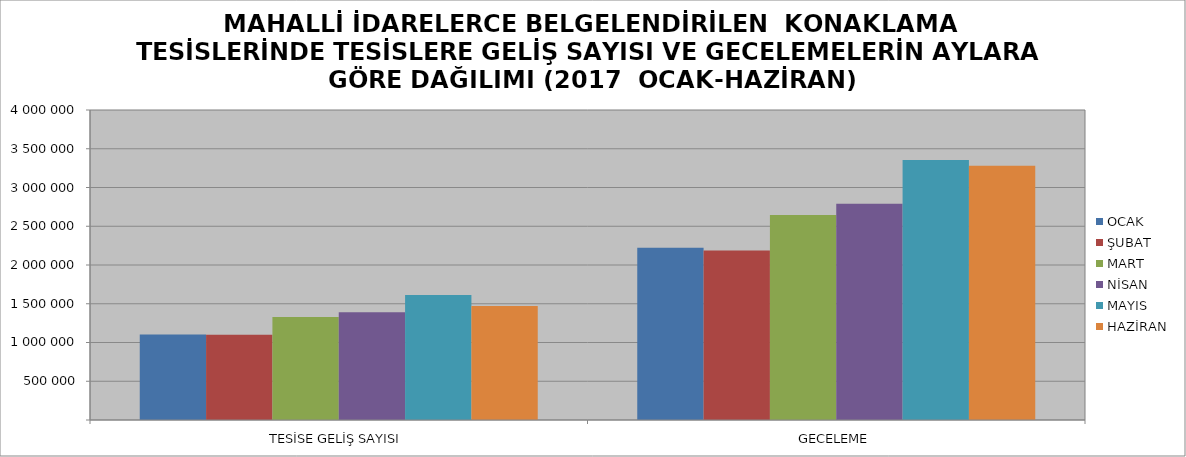
| Category | OCAK | ŞUBAT | MART | NİSAN | MAYIS | HAZİRAN |
|---|---|---|---|---|---|---|
| TESİSE GELİŞ SAYISI | 1104649 | 1099366 | 1327993 | 1389075 | 1611959 | 1472053 |
| GECELEME | 2222261 | 2187982 | 2645959 | 2791881 | 3355819 | 3280620 |